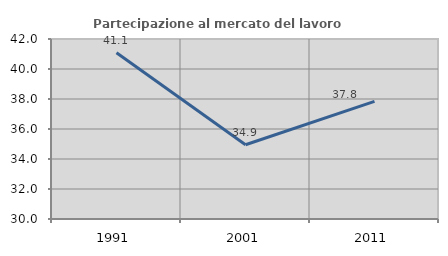
| Category | Partecipazione al mercato del lavoro  femminile |
|---|---|
| 1991.0 | 41.079 |
| 2001.0 | 34.947 |
| 2011.0 | 37.845 |